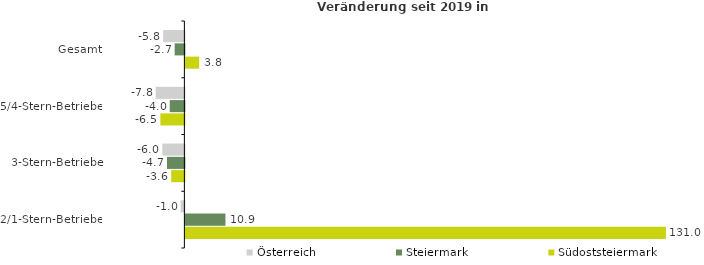
| Category | Österreich | Steiermark | Südoststeiermark |
|---|---|---|---|
| Gesamt | -5.779 | -2.653 | 3.76 |
| 5/4-Stern-Betriebe | -7.825 | -3.996 | -6.542 |
| 3-Stern-Betriebe | -6.014 | -4.748 | -3.585 |
| 2/1-Stern-Betriebe | -1.021 | 10.926 | 130.981 |